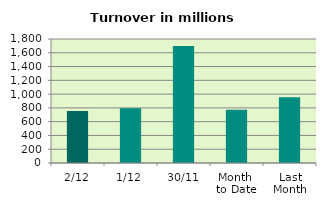
| Category | Series 0 |
|---|---|
| 2/12 | 753.581 |
| 1/12 | 795.529 |
| 30/11 | 1698.798 |
| Month 
to Date | 774.555 |
| Last
Month | 954.978 |